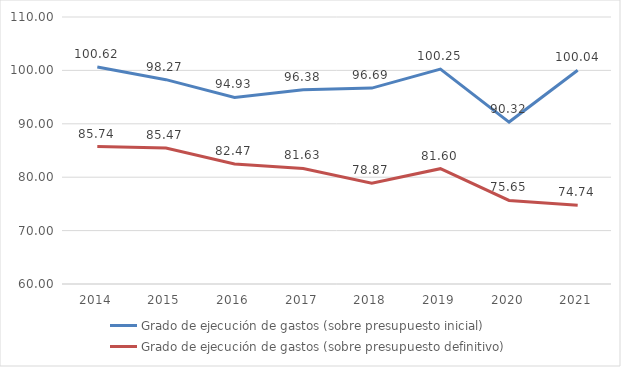
| Category | Grado de ejecución de gastos (sobre presupuesto inicial) | Grado de ejecución de gastos (sobre presupuesto definitivo) |
|---|---|---|
| 2014.0 | 100.621 | 85.741 |
| 2015.0 | 98.265 | 85.47 |
| 2016.0 | 94.93 | 82.471 |
| 2017.0 | 96.377 | 81.63 |
| 2018.0 | 96.687 | 78.87 |
| 2019.0 | 100.251 | 81.598 |
| 2020.0 | 90.324 | 75.647 |
| 2021.0 | 100.035 | 74.739 |